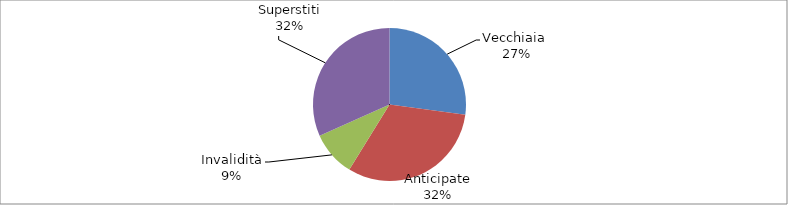
| Category | Series 0 |
|---|---|
| Vecchiaia  | 88968 |
| Anticipate | 103615 |
| Invalidità | 31238 |
| Superstiti | 103737 |